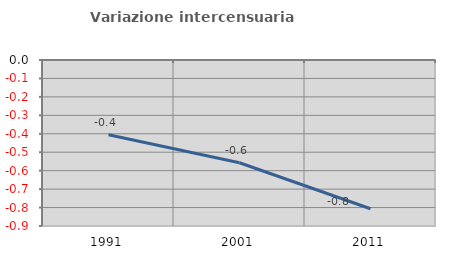
| Category | Variazione intercensuaria annua |
|---|---|
| 1991.0 | -0.405 |
| 2001.0 | -0.557 |
| 2011.0 | -0.806 |